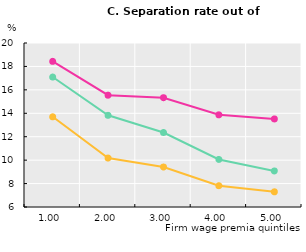
| Category | 25 to 34 | 35 to 49 | 50 to 60 |
|---|---|---|---|
| 1.0 | 17.096 | 13.701 | 18.435 |
| 2.0 | 13.826 | 10.18 | 15.542 |
| 3.0 | 12.361 | 9.409 | 15.328 |
| 4.0 | 10.058 | 7.819 | 13.869 |
| 5.0 | 9.075 | 7.296 | 13.517 |